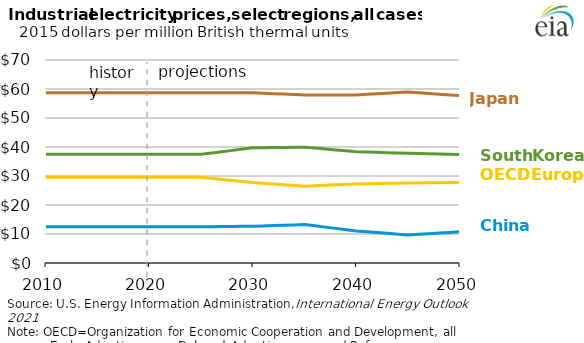
| Category | Series 0 | Series 3 | Series 1 | Series 2 |
|---|---|---|---|---|
| 2010.0 | 12.484 | 58.67 | 37.468 | 29.568 |
| 2011.0 | 12.484 | 58.67 | 37.468 | 29.568 |
| 2012.0 | 12.484 | 58.67 | 37.468 | 29.568 |
| 2013.0 | 12.484 | 58.67 | 37.468 | 29.568 |
| 2014.0 | 12.484 | 58.67 | 37.468 | 29.568 |
| 2015.0 | 12.484 | 58.67 | 37.468 | 29.568 |
| 2016.0 | 12.484 | 58.67 | 37.468 | 29.568 |
| 2017.0 | 12.484 | 58.67 | 37.468 | 29.568 |
| 2018.0 | 12.484 | 58.67 | 37.468 | 29.568 |
| 2019.0 | 12.484 | 58.67 | 37.468 | 29.568 |
| 2020.0 | 12.484 | 58.67 | 37.468 | 29.568 |
| 2021.0 | 12.484 | 58.67 | 37.468 | 29.568 |
| 2022.0 | 12.484 | 58.67 | 37.468 | 29.568 |
| 2023.0 | 12.484 | 58.67 | 37.468 | 29.568 |
| 2024.0 | 12.484 | 58.67 | 37.468 | 29.568 |
| 2025.0 | 12.484 | 58.67 | 37.468 | 29.568 |
| 2026.0 | 12.522 | 58.671 | 37.923 | 29.198 |
| 2027.0 | 12.56 | 58.672 | 38.378 | 28.828 |
| 2028.0 | 12.598 | 58.674 | 38.833 | 28.458 |
| 2029.0 | 12.636 | 58.675 | 39.288 | 28.088 |
| 2030.0 | 12.674 | 58.677 | 39.743 | 27.718 |
| 2031.0 | 12.788 | 58.533 | 39.784 | 27.469 |
| 2032.0 | 12.901 | 58.389 | 39.826 | 27.219 |
| 2033.0 | 13.015 | 58.245 | 39.867 | 26.969 |
| 2034.0 | 13.128 | 58.101 | 39.909 | 26.72 |
| 2035.0 | 13.241 | 57.957 | 39.95 | 26.47 |
| 2036.0 | 12.807 | 57.953 | 39.631 | 26.631 |
| 2037.0 | 12.372 | 57.948 | 39.312 | 26.792 |
| 2038.0 | 11.938 | 57.943 | 38.993 | 26.953 |
| 2039.0 | 11.503 | 57.938 | 38.673 | 27.114 |
| 2040.0 | 11.068 | 57.933 | 38.354 | 27.275 |
| 2041.0 | 10.788 | 58.148 | 38.254 | 27.337 |
| 2042.0 | 10.507 | 58.362 | 38.155 | 27.398 |
| 2043.0 | 10.227 | 58.576 | 38.055 | 27.46 |
| 2044.0 | 9.946 | 58.791 | 37.955 | 27.521 |
| 2045.0 | 9.665 | 59.005 | 37.855 | 27.583 |
| 2046.0 | 9.888 | 58.745 | 37.769 | 27.625 |
| 2047.0 | 10.111 | 58.484 | 37.682 | 27.667 |
| 2048.0 | 10.333 | 58.224 | 37.596 | 27.709 |
| 2049.0 | 10.556 | 57.964 | 37.509 | 27.752 |
| 2050.0 | 10.778 | 57.704 | 37.422 | 27.794 |